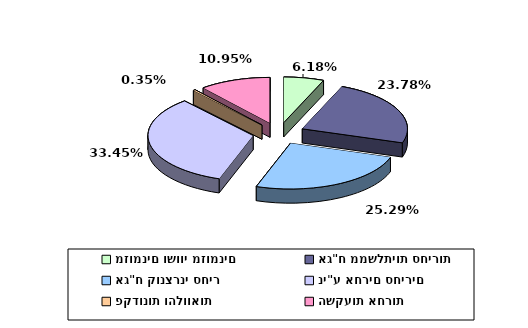
| Category | Series 0 |
|---|---|
| מזומנים ושווי מזומנים | 0.062 |
| אג"ח ממשלתיות סחירות | 0.238 |
| אג"ח קונצרני סחיר | 0.253 |
| ני"ע אחרים סחירים | 0.334 |
| פקדונות והלוואות | 0.004 |
| השקעות אחרות | 0.11 |